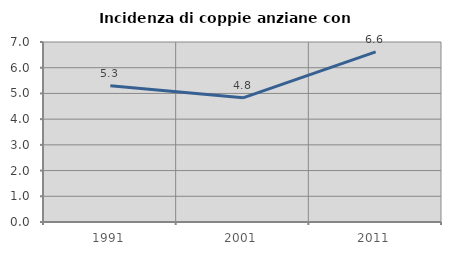
| Category | Incidenza di coppie anziane con figli |
|---|---|
| 1991.0 | 5.298 |
| 2001.0 | 4.828 |
| 2011.0 | 6.618 |